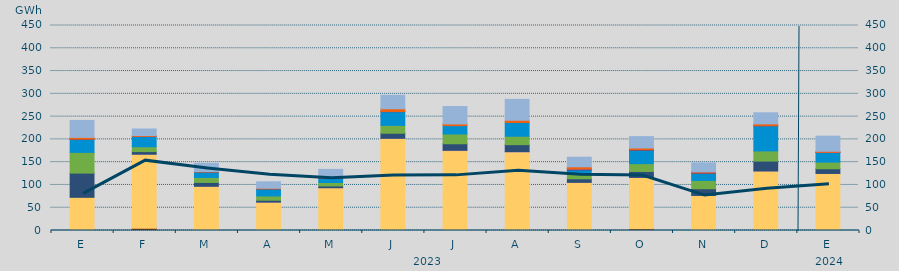
| Category | Carbón | Ciclo Combinado | Cogeneración | Consumo Bombeo | Eólica | Hidráulica | Nuclear | Otras Renovables | Solar fotovoltaica | Solar térmica | Turbinación bombeo |
|---|---|---|---|---|---|---|---|---|---|---|---|
| E | 1284.5 | 71547.4 | 0 | 53164.775 | 45462.95 | 28173.35 | 832.7 | 0 | 3920.525 | 0 | 37262.825 |
| F | 5209.75 | 162258.025 | 4.5 | 5734.4 | 10650.1 | 22890.65 | 0 | 26 | 1697.2 | 0 | 14370.575 |
| M | 1206.25 | 95878.75 | 28.525 | 8412.525 | 10950.5 | 11649.375 | 291.075 | 0 | 997.65 | 0 | 18026.625 |
| A | 95 | 62173.25 | 34.425 | 4159.95 | 9407.775 | 15400.95 | 65.5 | 0 | 1513.55 | 0 | 13985.1 |
| M | 53 | 93854.15 | 22.625 | 3893.75 | 7479.975 | 9063.875 | 377.575 | 0 | 1716.575 | 0 | 17696.4 |
| J | 1199.5 | 200824.35 | 314.8 | 11178.5 | 17206.65 | 30102.475 | 201.5 | 0 | 6216.85 | 0 | 29529.225 |
| J | 468.8 | 174954.2 | 648.625 | 14357.5 | 21420.05 | 18314.475 | 0 | 0 | 3759.55 | 0 | 38182.8 |
| A | 2071.15 | 170328.85 | 646.325 | 15367.25 | 18494.75 | 30120.575 | 0 | 0 | 4976.775 | 0 | 45807.425 |
| S | 242.5 | 105492.6 | 2.25 | 7781 | 9960.15 | 9303.9 | 1998.5 | 2 | 5033.1 | 0 | 21057.1 |
| O | 4030.7 | 112340.225 | 164.75 | 13063.5 | 17178.525 | 29288.975 | 1045.75 | 0 | 3984.725 | 0 | 25044.625 |
| N | 242.3 | 76778.675 | 2 | 14633.45 | 18267.525 | 15599.125 | 750.425 | 0 | 2214.45 | 2 | 19792.325 |
| D | 125 | 130542.65 | 20.625 | 21631.25 | 22334.375 | 55213.975 | 18.75 | 0 | 4181.575 | 0 | 24356.725 |
| E | 460 | 124757.625 | 36.5 | 10274.75 | 14486.075 | 21436.375 | 74.75 | 24 | 2324.925 | 0 | 33204.95 |